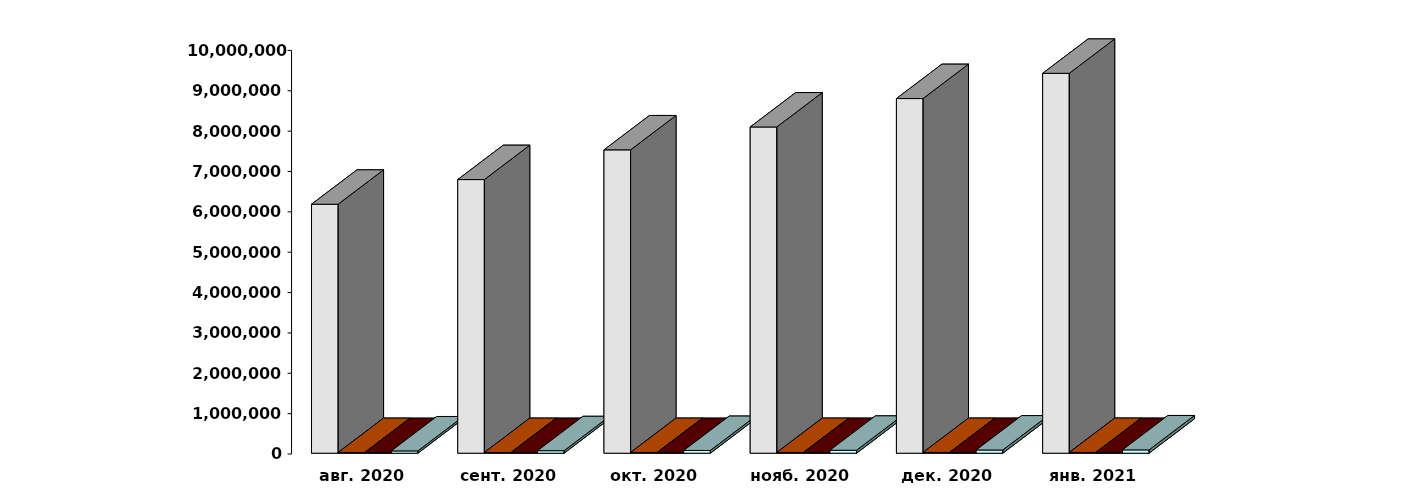
| Category | Физические лица | Юридические лица | Иностранные лица | Клиенты, передавшие свои средства в ДУ |
|---|---|---|---|---|
| 2020-08-30 | 6169141 | 18285 | 16204 | 57089 |
| 2020-09-30 | 6779757 | 18484 | 16494 | 62564 |
| 2020-10-30 | 7515934 | 18680 | 16861 | 67792 |
| 2020-11-30 | 8083085 | 18780 | 17081 | 73469 |
| 2020-12-31 | 8787077 | 19014 | 17268 | 79270 |
| 2021-01-31 | 9412672 | 19074 | 17041 | 82193 |